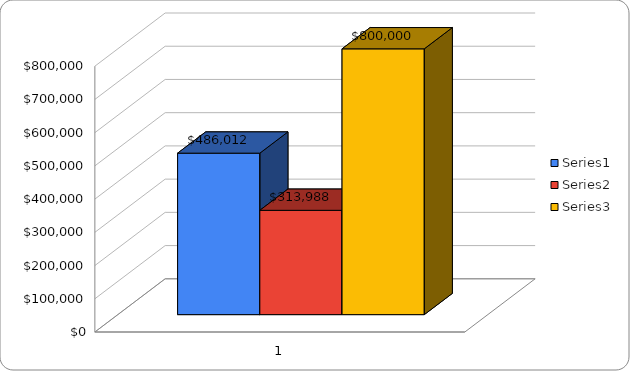
| Category | Series 0 | Series 1 | Series 2 |
|---|---|---|---|
| 0 | 486012.47 | 313987.53 | 800000 |